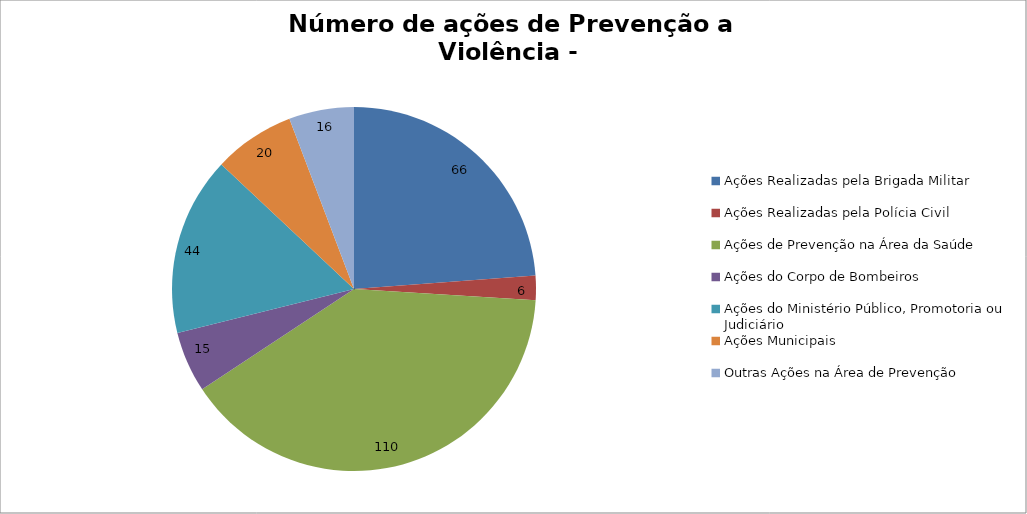
| Category | Número de Ações |
|---|---|
| Ações Realizadas pela Brigada Militar | 66 |
| Ações Realizadas pela Polícia Civil | 6 |
| Ações de Prevenção na Área da Saúde | 110 |
| Ações do Corpo de Bombeiros | 15 |
| Ações do Ministério Público, Promotoria ou Judiciário | 44 |
| Ações Municipais | 20 |
| Outras Ações na Área de Prevenção | 16 |